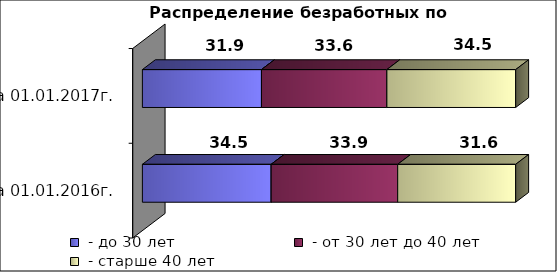
| Category |  - до 30 лет  |  - от 30 лет до 40 лет  |  - старше 40 лет  |
|---|---|---|---|
| на 01.01.2016г. | 34.5 | 33.9 | 31.6 |
| на 01.01.2017г. | 31.9 | 33.6 | 34.5 |